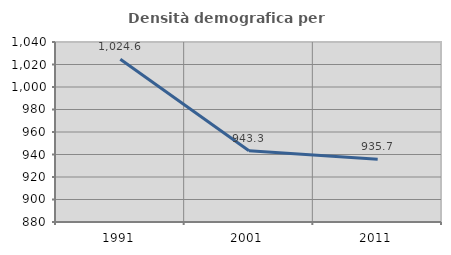
| Category | Densità demografica |
|---|---|
| 1991.0 | 1024.581 |
| 2001.0 | 943.303 |
| 2011.0 | 935.722 |